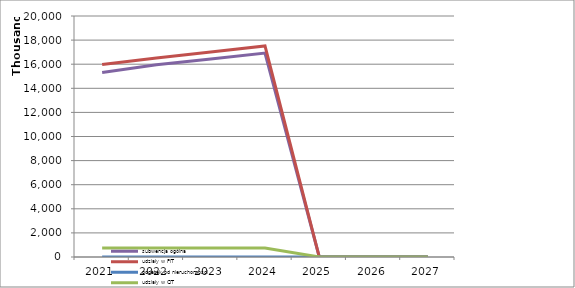
| Category | subwencja ogólna | udziały w PIT | podatek od nieruchomości | udziały w CIT |
|---|---|---|---|---|
| 2021.0 | 15304700 | 15966862 | 0 | 750000 |
| 2022.0 | 15957109 | 16509735 | 0 | 750000 |
| 2023.0 | 16435823 | 17005027 | 0 | 750000 |
| 2024.0 | 16928897 | 17515178 | 0 | 750000 |
| 2025.0 | 0 | 0 | 0 | 0 |
| 2026.0 | 0 | 0 | 0 | 0 |
| 2027.0 | 0 | 0 | 0 | 0 |